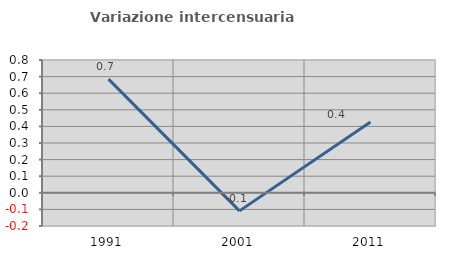
| Category | Variazione intercensuaria annua |
|---|---|
| 1991.0 | 0.685 |
| 2001.0 | -0.109 |
| 2011.0 | 0.427 |